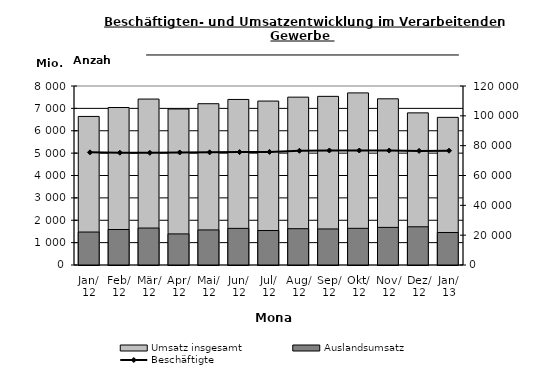
| Category | Umsatz insgesamt | Auslandsumsatz |
|---|---|---|
| 2012-01-01 | 6640.077 | 1473.222 |
| 2012-02-01 | 7038.621 | 1586.306 |
| 2012-03-01 | 7416.484 | 1651.678 |
| 2012-04-01 | 6972.158 | 1389.091 |
| 2012-05-01 | 7208.203 | 1567.272 |
| 2012-06-01 | 7399.131 | 1636.887 |
| 2012-07-01 | 7327.339 | 1540.606 |
| 2012-08-01 | 7501.535 | 1622.307 |
| 2012-09-01 | 7537.073 | 1611.325 |
| 2012-10-01 | 7691.386 | 1638.671 |
| 2012-11-01 | 7427.668 | 1680.559 |
| 2012-12-01 | 6799.178 | 1707.786 |
| 2013-01-01 | 6598.983 | 1453.122 |